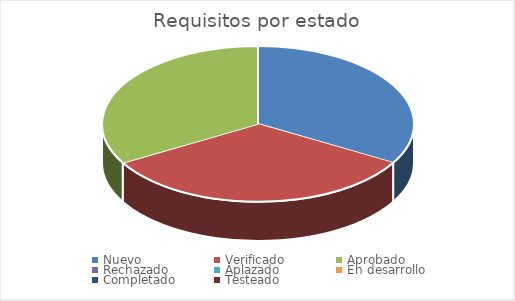
| Category | Series 0 |
|---|---|
| Nuevo | 1 |
| Verificado | 1 |
| Aprobado | 1 |
| Rechazado | 0 |
| Aplazado | 0 |
| En desarrollo | 0 |
| Completado | 0 |
| Testeado | 0 |